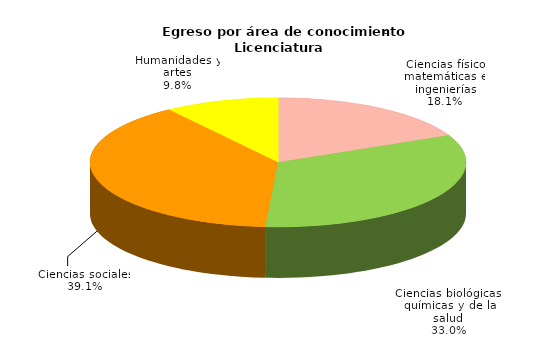
| Category | Series 0 |
|---|---|
| Ciencias físico matemáticas e ingenierías | 5961 |
| Ciencias biológicas, químicas y de la salud | 10879 |
| Ciencias sociales | 12898 |
| Humanidades y artes | 3236 |